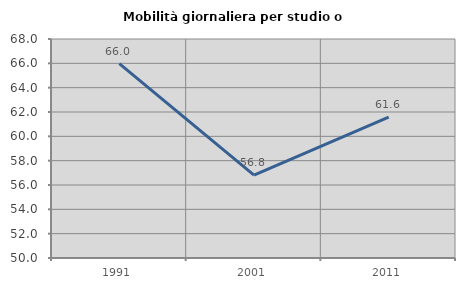
| Category | Mobilità giornaliera per studio o lavoro |
|---|---|
| 1991.0 | 65.97 |
| 2001.0 | 56.805 |
| 2011.0 | 61.579 |